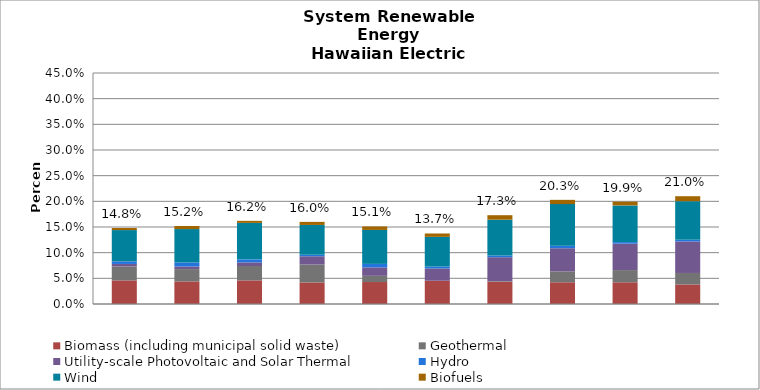
| Category | Biomass (including municipal solid waste) | Geothermal | Utility-scale Photovoltaic and Solar Thermal | Hydro | Wind | Biofuels |
|---|---|---|---|---|---|---|
| 2014.0 | 0.046 | 0.027 | 0.005 | 0.005 | 0.061 | 0.004 |
| 2015.0 | 0.044 | 0.024 | 0.005 | 0.008 | 0.065 | 0.006 |
| 2016.0 | 0.046 | 0.028 | 0.007 | 0.006 | 0.071 | 0.004 |
| 2017.0 | 0.042 | 0.035 | 0.016 | 0.003 | 0.058 | 0.006 |
| 2018.0 | 0.043 | 0.012 | 0.016 | 0.007 | 0.066 | 0.007 |
| 2019.0 | 0.045 | 0 | 0.024 | 0.004 | 0.058 | 0.007 |
| 2020.0 | 0.043 | 0.001 | 0.047 | 0.003 | 0.07 | 0.009 |
| 2021.0 | 0.042 | 0.021 | 0.045 | 0.005 | 0.081 | 0.008 |
| 2022.0 | 0.042 | 0.024 | 0.051 | 0.003 | 0.071 | 0.007 |
| 2023.0 | 0.038 | 0.022 | 0.061 | 0.003 | 0.075 | 0.01 |